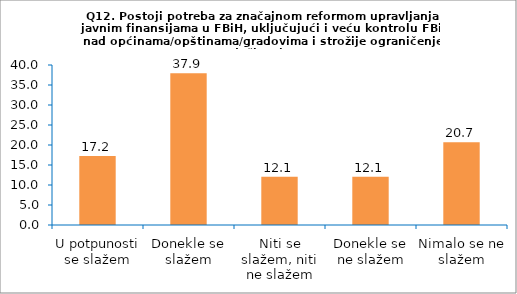
| Category | Series 0 |
|---|---|
| U potpunosti se slažem | 17.241 |
| Donekle se slažem | 37.931 |
| Niti se slažem, niti ne slažem | 12.069 |
| Donekle se ne slažem | 12.069 |
| Nimalo se ne slažem | 20.69 |